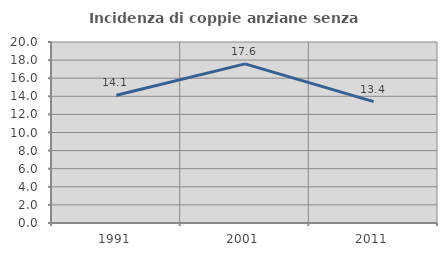
| Category | Incidenza di coppie anziane senza figli  |
|---|---|
| 1991.0 | 14.118 |
| 2001.0 | 17.582 |
| 2011.0 | 13.415 |